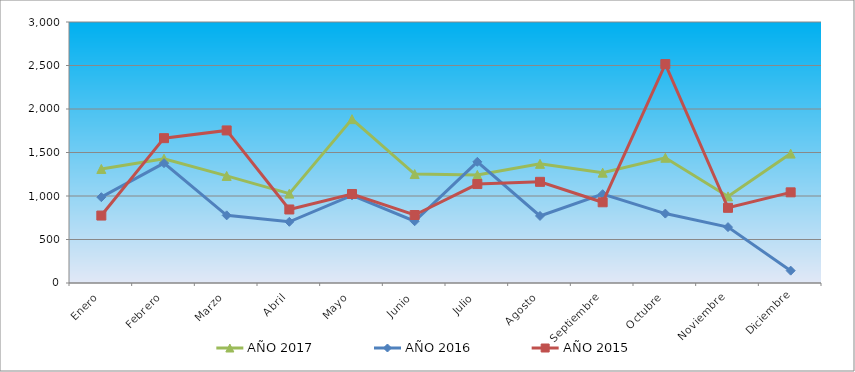
| Category | AÑO 2017 | AÑO 2016 | AÑO 2015 |
|---|---|---|---|
| Enero | 1311.009 | 986.519 | 775.2 |
| Febrero | 1428.732 | 1377.284 | 1664.774 |
| Marzo | 1230.743 | 777.555 | 1753.732 |
| Abril | 1027.403 | 703.18 | 845.095 |
| Mayo | 1883.572 | 1007.44 | 1023.01 |
| Junio | 1252.147 | 709.941 | 781.554 |
| Julio | 1241.445 | 1392.837 | 1137.384 |
| Agosto | 1369.871 | 770.793 | 1162.801 |
| Septiembre | 1268.201 | 1020.963 | 927.699 |
| Octubre | 1439.434 | 797.839 | 2516.224 |
| Noviembre | 995.297 | 642.328 | 864.158 |
| Diciembre | 1487.594 | 141.988 | 1042.073 |